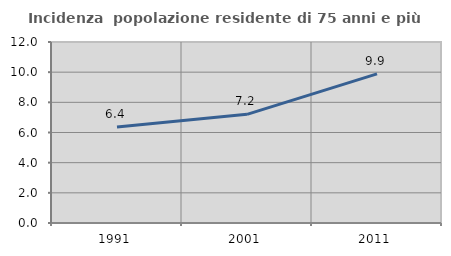
| Category | Incidenza  popolazione residente di 75 anni e più |
|---|---|
| 1991.0 | 6.36 |
| 2001.0 | 7.202 |
| 2011.0 | 9.886 |